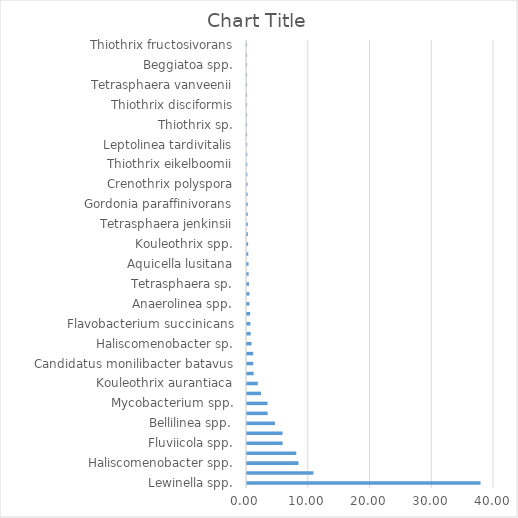
| Category | Series 0 |
|---|---|
| Lewinella spp. | 37.817 |
| Sphaerotilus spp. | 10.754 |
| Haliscomenobacter spp. | 8.333 |
| Tetrasphaera spp. | 7.979 |
| Fluviicola spp. | 5.767 |
| Longilinea spp. | 5.757 |
| Bellilinea spp. | 4.526 |
| Crocinitomix spp. | 3.344 |
| Mycobacterium spp. | 3.333 |
| Candidatus microthrix parvicella | 2.271 |
| Kouleothrix aurantiaca | 1.747 |
| Flavobacterium gelidilacus | 1.08 |
| Candidatus monilibacter batavus | 1.007 |
| Lewinella sp. | 0.998 |
| Haliscomenobacter sp. | 0.731 |
| Levilinea spp. | 0.591 |
| Flavobacterium succinicans | 0.55 |
| Clostridium perfringens | 0.508 |
| Anaerolinea spp. | 0.385 |
| Acinetobacter johnsonii | 0.378 |
| Tetrasphaera sp. | 0.321 |
| Haliscomenobacter hydrossis | 0.27 |
| Aquicella lusitana | 0.254 |
| Anaerolinea thermolimosa | 0.209 |
| Kouleothrix spp. | 0.182 |
| Beggiatoa sp. | 0.146 |
| Tetrasphaera jenkinsii | 0.127 |
| Uncultured candidatus microthrix sp. | 0.121 |
| Gordonia paraffinivorans | 0.118 |
| Candidatus alysiosphaera europeae | 0.096 |
| Crenothrix polyspora | 0.08 |
| Aquicella spp. | 0.048 |
| Thiothrix eikelboomii | 0.041 |
| Levilinea saccharolytica | 0.039 |
| Leptolinea tardivitalis | 0.025 |
| Thiothrix spp. | 0.011 |
| Thiothrix sp. | 0.011 |
| Bellilinea caldifistulae | 0.009 |
| Thiothrix disciformis | 0.008 |
| Leptolinea spp. | 0.007 |
| Tetrasphaera vanveenii | 0.005 |
| Tetrasphaera australiensis | 0.005 |
| Beggiatoa spp. | 0.005 |
| Candidatus microthrix calida | 0.004 |
| Thiothrix fructosivorans | 0.002 |